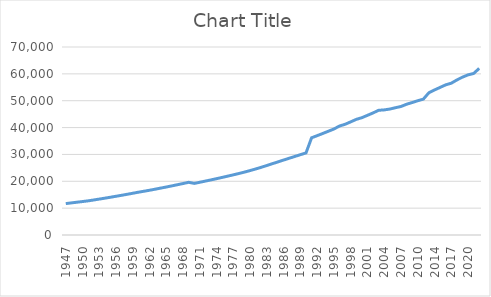
| Category | Series 0 |
|---|---|
| 1947 | 11694 |
| 1948 | 11957 |
| 1949 | 12212 |
| 1950 | 12458 |
| 1951 | 12716 |
| 1952 | 13040 |
| 1953 | 13376 |
| 1954 | 13717 |
| 1955 | 14067 |
| 1956 | 14421 |
| 1957 | 14786 |
| 1958 | 15160 |
| 1959 | 15546 |
| 1960 | 15938 |
| 1961 | 16297 |
| 1962 | 16664 |
| 1963 | 17057 |
| 1964 | 17474 |
| 1965 | 17867 |
| 1966 | 18298 |
| 1967 | 18733 |
| 1968 | 19167 |
| 1969 | 19618 |
| 1970 | 19211 |
| 1971 | 19640 |
| 1972 | 20080 |
| 1973 | 20524 |
| 1974 | 20980 |
| 1975 | 21447 |
| 1976 | 21921 |
| 1977 | 22410 |
| 1978 | 22907 |
| 1979 | 23434 |
| 1980 | 23994 |
| 1981 | 24591 |
| 1982 | 25215 |
| 1983 | 25887 |
| 1984 | 26564 |
| 1985 | 27241 |
| 1986 | 27916 |
| 1987 | 28587 |
| 1988 | 29249 |
| 1989 | 29908 |
| 1990 | 30575 |
| 1991 | 36199 |
| 1992 | 36992 |
| 1993 | 37802 |
| 1994 | 38631 |
| 1995 | 39477 |
| 1996 | 40584 |
| 1997 | 41227 |
| 1998 | 42131 |
| 1999 | 43054 |
| 2000 | 43686 |
| 2001 | 44561 |
| 20022 | 45454 |
| 2003 | 46429 |
| 2004 | 46586 |
| 2005 | 46889 |
| 2006 | 47391 |
| 2007 | 47850 |
| 2008 | 48686 |
| 2009 | 49321 |
| 2010 | 49991 |
| 2011 | 50587 |
| 2013 | 52982 |
| 2014 | 54002 |
| 2015 | 54957 |
| 2016 | 55909 |
| 2017 | 56522 |
| 2018 | 57726 |
| 2019 | 58775 |
| 2020 | 59622 |
| 2021 | 60143 |
| 20223 | 62028 |